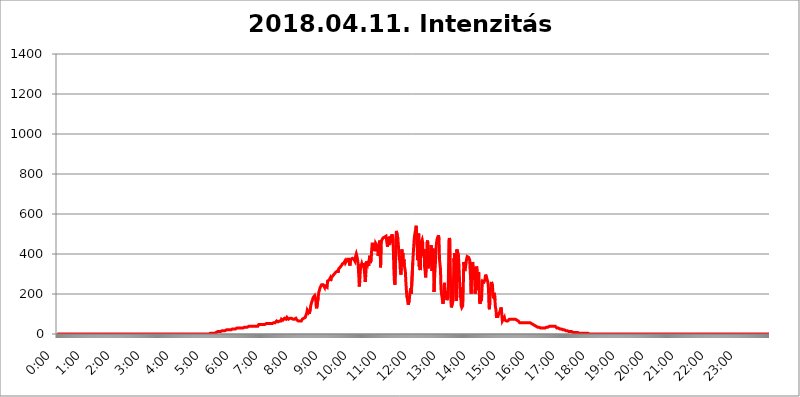
| Category | 2018.04.11. Intenzitás [W/m^2] |
|---|---|
| 0.0 | 0 |
| 0.0006944444444444445 | 0 |
| 0.001388888888888889 | 0 |
| 0.0020833333333333333 | 0 |
| 0.002777777777777778 | 0 |
| 0.003472222222222222 | 0 |
| 0.004166666666666667 | 0 |
| 0.004861111111111111 | 0 |
| 0.005555555555555556 | 0 |
| 0.0062499999999999995 | 0 |
| 0.006944444444444444 | 0 |
| 0.007638888888888889 | 0 |
| 0.008333333333333333 | 0 |
| 0.009027777777777779 | 0 |
| 0.009722222222222222 | 0 |
| 0.010416666666666666 | 0 |
| 0.011111111111111112 | 0 |
| 0.011805555555555555 | 0 |
| 0.012499999999999999 | 0 |
| 0.013194444444444444 | 0 |
| 0.013888888888888888 | 0 |
| 0.014583333333333332 | 0 |
| 0.015277777777777777 | 0 |
| 0.015972222222222224 | 0 |
| 0.016666666666666666 | 0 |
| 0.017361111111111112 | 0 |
| 0.018055555555555557 | 0 |
| 0.01875 | 0 |
| 0.019444444444444445 | 0 |
| 0.02013888888888889 | 0 |
| 0.020833333333333332 | 0 |
| 0.02152777777777778 | 0 |
| 0.022222222222222223 | 0 |
| 0.02291666666666667 | 0 |
| 0.02361111111111111 | 0 |
| 0.024305555555555556 | 0 |
| 0.024999999999999998 | 0 |
| 0.025694444444444447 | 0 |
| 0.02638888888888889 | 0 |
| 0.027083333333333334 | 0 |
| 0.027777777777777776 | 0 |
| 0.02847222222222222 | 0 |
| 0.029166666666666664 | 0 |
| 0.029861111111111113 | 0 |
| 0.030555555555555555 | 0 |
| 0.03125 | 0 |
| 0.03194444444444445 | 0 |
| 0.03263888888888889 | 0 |
| 0.03333333333333333 | 0 |
| 0.034027777777777775 | 0 |
| 0.034722222222222224 | 0 |
| 0.035416666666666666 | 0 |
| 0.036111111111111115 | 0 |
| 0.03680555555555556 | 0 |
| 0.0375 | 0 |
| 0.03819444444444444 | 0 |
| 0.03888888888888889 | 0 |
| 0.03958333333333333 | 0 |
| 0.04027777777777778 | 0 |
| 0.04097222222222222 | 0 |
| 0.041666666666666664 | 0 |
| 0.042361111111111106 | 0 |
| 0.04305555555555556 | 0 |
| 0.043750000000000004 | 0 |
| 0.044444444444444446 | 0 |
| 0.04513888888888889 | 0 |
| 0.04583333333333334 | 0 |
| 0.04652777777777778 | 0 |
| 0.04722222222222222 | 0 |
| 0.04791666666666666 | 0 |
| 0.04861111111111111 | 0 |
| 0.049305555555555554 | 0 |
| 0.049999999999999996 | 0 |
| 0.05069444444444445 | 0 |
| 0.051388888888888894 | 0 |
| 0.052083333333333336 | 0 |
| 0.05277777777777778 | 0 |
| 0.05347222222222222 | 0 |
| 0.05416666666666667 | 0 |
| 0.05486111111111111 | 0 |
| 0.05555555555555555 | 0 |
| 0.05625 | 0 |
| 0.05694444444444444 | 0 |
| 0.057638888888888885 | 0 |
| 0.05833333333333333 | 0 |
| 0.05902777777777778 | 0 |
| 0.059722222222222225 | 0 |
| 0.06041666666666667 | 0 |
| 0.061111111111111116 | 0 |
| 0.06180555555555556 | 0 |
| 0.0625 | 0 |
| 0.06319444444444444 | 0 |
| 0.06388888888888888 | 0 |
| 0.06458333333333334 | 0 |
| 0.06527777777777778 | 0 |
| 0.06597222222222222 | 0 |
| 0.06666666666666667 | 0 |
| 0.06736111111111111 | 0 |
| 0.06805555555555555 | 0 |
| 0.06874999999999999 | 0 |
| 0.06944444444444443 | 0 |
| 0.07013888888888889 | 0 |
| 0.07083333333333333 | 0 |
| 0.07152777777777779 | 0 |
| 0.07222222222222223 | 0 |
| 0.07291666666666667 | 0 |
| 0.07361111111111111 | 0 |
| 0.07430555555555556 | 0 |
| 0.075 | 0 |
| 0.07569444444444444 | 0 |
| 0.0763888888888889 | 0 |
| 0.07708333333333334 | 0 |
| 0.07777777777777778 | 0 |
| 0.07847222222222222 | 0 |
| 0.07916666666666666 | 0 |
| 0.0798611111111111 | 0 |
| 0.08055555555555556 | 0 |
| 0.08125 | 0 |
| 0.08194444444444444 | 0 |
| 0.08263888888888889 | 0 |
| 0.08333333333333333 | 0 |
| 0.08402777777777777 | 0 |
| 0.08472222222222221 | 0 |
| 0.08541666666666665 | 0 |
| 0.08611111111111112 | 0 |
| 0.08680555555555557 | 0 |
| 0.08750000000000001 | 0 |
| 0.08819444444444445 | 0 |
| 0.08888888888888889 | 0 |
| 0.08958333333333333 | 0 |
| 0.09027777777777778 | 0 |
| 0.09097222222222222 | 0 |
| 0.09166666666666667 | 0 |
| 0.09236111111111112 | 0 |
| 0.09305555555555556 | 0 |
| 0.09375 | 0 |
| 0.09444444444444444 | 0 |
| 0.09513888888888888 | 0 |
| 0.09583333333333333 | 0 |
| 0.09652777777777777 | 0 |
| 0.09722222222222222 | 0 |
| 0.09791666666666667 | 0 |
| 0.09861111111111111 | 0 |
| 0.09930555555555555 | 0 |
| 0.09999999999999999 | 0 |
| 0.10069444444444443 | 0 |
| 0.1013888888888889 | 0 |
| 0.10208333333333335 | 0 |
| 0.10277777777777779 | 0 |
| 0.10347222222222223 | 0 |
| 0.10416666666666667 | 0 |
| 0.10486111111111111 | 0 |
| 0.10555555555555556 | 0 |
| 0.10625 | 0 |
| 0.10694444444444444 | 0 |
| 0.1076388888888889 | 0 |
| 0.10833333333333334 | 0 |
| 0.10902777777777778 | 0 |
| 0.10972222222222222 | 0 |
| 0.1111111111111111 | 0 |
| 0.11180555555555556 | 0 |
| 0.11180555555555556 | 0 |
| 0.1125 | 0 |
| 0.11319444444444444 | 0 |
| 0.11388888888888889 | 0 |
| 0.11458333333333333 | 0 |
| 0.11527777777777777 | 0 |
| 0.11597222222222221 | 0 |
| 0.11666666666666665 | 0 |
| 0.1173611111111111 | 0 |
| 0.11805555555555557 | 0 |
| 0.11944444444444445 | 0 |
| 0.12013888888888889 | 0 |
| 0.12083333333333333 | 0 |
| 0.12152777777777778 | 0 |
| 0.12222222222222223 | 0 |
| 0.12291666666666667 | 0 |
| 0.12291666666666667 | 0 |
| 0.12361111111111112 | 0 |
| 0.12430555555555556 | 0 |
| 0.125 | 0 |
| 0.12569444444444444 | 0 |
| 0.12638888888888888 | 0 |
| 0.12708333333333333 | 0 |
| 0.16875 | 0 |
| 0.12847222222222224 | 0 |
| 0.12916666666666668 | 0 |
| 0.12986111111111112 | 0 |
| 0.13055555555555556 | 0 |
| 0.13125 | 0 |
| 0.13194444444444445 | 0 |
| 0.1326388888888889 | 0 |
| 0.13333333333333333 | 0 |
| 0.13402777777777777 | 0 |
| 0.13402777777777777 | 0 |
| 0.13472222222222222 | 0 |
| 0.13541666666666666 | 0 |
| 0.1361111111111111 | 0 |
| 0.13749999999999998 | 0 |
| 0.13819444444444443 | 0 |
| 0.1388888888888889 | 0 |
| 0.13958333333333334 | 0 |
| 0.14027777777777778 | 0 |
| 0.14097222222222222 | 0 |
| 0.14166666666666666 | 0 |
| 0.1423611111111111 | 0 |
| 0.14305555555555557 | 0 |
| 0.14375000000000002 | 0 |
| 0.14444444444444446 | 0 |
| 0.1451388888888889 | 0 |
| 0.1451388888888889 | 0 |
| 0.14652777777777778 | 0 |
| 0.14722222222222223 | 0 |
| 0.14791666666666667 | 0 |
| 0.1486111111111111 | 0 |
| 0.14930555555555555 | 0 |
| 0.15 | 0 |
| 0.15069444444444444 | 0 |
| 0.15138888888888888 | 0 |
| 0.15208333333333332 | 0 |
| 0.15277777777777776 | 0 |
| 0.15347222222222223 | 0 |
| 0.15416666666666667 | 0 |
| 0.15486111111111112 | 0 |
| 0.15555555555555556 | 0 |
| 0.15625 | 0 |
| 0.15694444444444444 | 0 |
| 0.15763888888888888 | 0 |
| 0.15833333333333333 | 0 |
| 0.15902777777777777 | 0 |
| 0.15972222222222224 | 0 |
| 0.16041666666666668 | 0 |
| 0.16111111111111112 | 0 |
| 0.16180555555555556 | 0 |
| 0.1625 | 0 |
| 0.16319444444444445 | 0 |
| 0.1638888888888889 | 0 |
| 0.16458333333333333 | 0 |
| 0.16527777777777777 | 0 |
| 0.16597222222222222 | 0 |
| 0.16666666666666666 | 0 |
| 0.1673611111111111 | 0 |
| 0.16805555555555554 | 0 |
| 0.16874999999999998 | 0 |
| 0.16944444444444443 | 0 |
| 0.17013888888888887 | 0 |
| 0.1708333333333333 | 0 |
| 0.17152777777777775 | 0 |
| 0.17222222222222225 | 0 |
| 0.1729166666666667 | 0 |
| 0.17361111111111113 | 0 |
| 0.17430555555555557 | 0 |
| 0.17500000000000002 | 0 |
| 0.17569444444444446 | 0 |
| 0.1763888888888889 | 0 |
| 0.17708333333333334 | 0 |
| 0.17777777777777778 | 0 |
| 0.17847222222222223 | 0 |
| 0.17916666666666667 | 0 |
| 0.1798611111111111 | 0 |
| 0.18055555555555555 | 0 |
| 0.18125 | 0 |
| 0.18194444444444444 | 0 |
| 0.1826388888888889 | 0 |
| 0.18333333333333335 | 0 |
| 0.1840277777777778 | 0 |
| 0.18472222222222223 | 0 |
| 0.18541666666666667 | 0 |
| 0.18611111111111112 | 0 |
| 0.18680555555555556 | 0 |
| 0.1875 | 0 |
| 0.18819444444444444 | 0 |
| 0.18888888888888888 | 0 |
| 0.18958333333333333 | 0 |
| 0.19027777777777777 | 0 |
| 0.1909722222222222 | 0 |
| 0.19166666666666665 | 0 |
| 0.19236111111111112 | 0 |
| 0.19305555555555554 | 0 |
| 0.19375 | 0 |
| 0.19444444444444445 | 0 |
| 0.1951388888888889 | 0 |
| 0.19583333333333333 | 0 |
| 0.19652777777777777 | 0 |
| 0.19722222222222222 | 0 |
| 0.19791666666666666 | 0 |
| 0.1986111111111111 | 0 |
| 0.19930555555555554 | 0 |
| 0.19999999999999998 | 0 |
| 0.20069444444444443 | 0 |
| 0.20138888888888887 | 0 |
| 0.2020833333333333 | 0 |
| 0.2027777777777778 | 0 |
| 0.2034722222222222 | 0 |
| 0.2041666666666667 | 0 |
| 0.20486111111111113 | 0 |
| 0.20555555555555557 | 0 |
| 0.20625000000000002 | 0 |
| 0.20694444444444446 | 0 |
| 0.2076388888888889 | 0 |
| 0.20833333333333334 | 0 |
| 0.20902777777777778 | 0 |
| 0.20972222222222223 | 0 |
| 0.21041666666666667 | 0 |
| 0.2111111111111111 | 0 |
| 0.21180555555555555 | 0 |
| 0.2125 | 0 |
| 0.21319444444444444 | 0 |
| 0.2138888888888889 | 0 |
| 0.21458333333333335 | 3.525 |
| 0.2152777777777778 | 3.525 |
| 0.21597222222222223 | 3.525 |
| 0.21666666666666667 | 3.525 |
| 0.21736111111111112 | 3.525 |
| 0.21805555555555556 | 3.525 |
| 0.21875 | 3.525 |
| 0.21944444444444444 | 3.525 |
| 0.22013888888888888 | 3.525 |
| 0.22083333333333333 | 3.525 |
| 0.22152777777777777 | 7.887 |
| 0.2222222222222222 | 7.887 |
| 0.22291666666666665 | 7.887 |
| 0.2236111111111111 | 7.887 |
| 0.22430555555555556 | 12.257 |
| 0.225 | 12.257 |
| 0.22569444444444445 | 12.257 |
| 0.2263888888888889 | 12.257 |
| 0.22708333333333333 | 12.257 |
| 0.22777777777777777 | 12.257 |
| 0.22847222222222222 | 12.257 |
| 0.22916666666666666 | 12.257 |
| 0.2298611111111111 | 12.257 |
| 0.23055555555555554 | 16.636 |
| 0.23124999999999998 | 16.636 |
| 0.23194444444444443 | 16.636 |
| 0.23263888888888887 | 16.636 |
| 0.2333333333333333 | 16.636 |
| 0.2340277777777778 | 16.636 |
| 0.2347222222222222 | 16.636 |
| 0.2354166666666667 | 16.636 |
| 0.23611111111111113 | 21.024 |
| 0.23680555555555557 | 21.024 |
| 0.23750000000000002 | 21.024 |
| 0.23819444444444446 | 21.024 |
| 0.2388888888888889 | 21.024 |
| 0.23958333333333334 | 21.024 |
| 0.24027777777777778 | 21.024 |
| 0.24097222222222223 | 21.024 |
| 0.24166666666666667 | 21.024 |
| 0.2423611111111111 | 21.024 |
| 0.24305555555555555 | 21.024 |
| 0.24375 | 21.024 |
| 0.24444444444444446 | 21.024 |
| 0.24513888888888888 | 21.024 |
| 0.24583333333333335 | 25.419 |
| 0.2465277777777778 | 25.419 |
| 0.24722222222222223 | 25.419 |
| 0.24791666666666667 | 25.419 |
| 0.24861111111111112 | 25.419 |
| 0.24930555555555556 | 25.419 |
| 0.25 | 25.419 |
| 0.25069444444444444 | 29.823 |
| 0.2513888888888889 | 29.823 |
| 0.2520833333333333 | 29.823 |
| 0.25277777777777777 | 29.823 |
| 0.2534722222222222 | 29.823 |
| 0.25416666666666665 | 29.823 |
| 0.2548611111111111 | 29.823 |
| 0.2555555555555556 | 29.823 |
| 0.25625000000000003 | 29.823 |
| 0.2569444444444445 | 29.823 |
| 0.2576388888888889 | 29.823 |
| 0.25833333333333336 | 29.823 |
| 0.2590277777777778 | 29.823 |
| 0.25972222222222224 | 29.823 |
| 0.2604166666666667 | 29.823 |
| 0.2611111111111111 | 29.823 |
| 0.26180555555555557 | 29.823 |
| 0.2625 | 34.234 |
| 0.26319444444444445 | 34.234 |
| 0.2638888888888889 | 34.234 |
| 0.26458333333333334 | 34.234 |
| 0.2652777777777778 | 38.653 |
| 0.2659722222222222 | 34.234 |
| 0.26666666666666666 | 34.234 |
| 0.2673611111111111 | 38.653 |
| 0.26805555555555555 | 38.653 |
| 0.26875 | 38.653 |
| 0.26944444444444443 | 38.653 |
| 0.2701388888888889 | 34.234 |
| 0.2708333333333333 | 38.653 |
| 0.27152777777777776 | 38.653 |
| 0.2722222222222222 | 38.653 |
| 0.27291666666666664 | 38.653 |
| 0.2736111111111111 | 38.653 |
| 0.2743055555555555 | 38.653 |
| 0.27499999999999997 | 38.653 |
| 0.27569444444444446 | 38.653 |
| 0.27638888888888885 | 38.653 |
| 0.27708333333333335 | 38.653 |
| 0.2777777777777778 | 38.653 |
| 0.27847222222222223 | 38.653 |
| 0.2791666666666667 | 38.653 |
| 0.2798611111111111 | 38.653 |
| 0.28055555555555556 | 38.653 |
| 0.28125 | 38.653 |
| 0.28194444444444444 | 43.079 |
| 0.2826388888888889 | 47.511 |
| 0.2833333333333333 | 47.511 |
| 0.28402777777777777 | 47.511 |
| 0.2847222222222222 | 47.511 |
| 0.28541666666666665 | 47.511 |
| 0.28611111111111115 | 47.511 |
| 0.28680555555555554 | 47.511 |
| 0.28750000000000003 | 47.511 |
| 0.2881944444444445 | 47.511 |
| 0.2888888888888889 | 47.511 |
| 0.28958333333333336 | 47.511 |
| 0.2902777777777778 | 47.511 |
| 0.29097222222222224 | 47.511 |
| 0.2916666666666667 | 51.951 |
| 0.2923611111111111 | 51.951 |
| 0.29305555555555557 | 51.951 |
| 0.29375 | 51.951 |
| 0.29444444444444445 | 51.951 |
| 0.2951388888888889 | 51.951 |
| 0.29583333333333334 | 51.951 |
| 0.2965277777777778 | 51.951 |
| 0.2972222222222222 | 51.951 |
| 0.29791666666666666 | 51.951 |
| 0.2986111111111111 | 51.951 |
| 0.29930555555555555 | 51.951 |
| 0.3 | 51.951 |
| 0.30069444444444443 | 51.951 |
| 0.3013888888888889 | 51.951 |
| 0.3020833333333333 | 56.398 |
| 0.30277777777777776 | 56.398 |
| 0.3034722222222222 | 56.398 |
| 0.30416666666666664 | 56.398 |
| 0.3048611111111111 | 56.398 |
| 0.3055555555555555 | 56.398 |
| 0.30624999999999997 | 60.85 |
| 0.3069444444444444 | 60.85 |
| 0.3076388888888889 | 65.31 |
| 0.30833333333333335 | 65.31 |
| 0.3090277777777778 | 60.85 |
| 0.30972222222222223 | 60.85 |
| 0.3104166666666667 | 60.85 |
| 0.3111111111111111 | 60.85 |
| 0.31180555555555556 | 65.31 |
| 0.3125 | 65.31 |
| 0.31319444444444444 | 65.31 |
| 0.3138888888888889 | 65.31 |
| 0.3145833333333333 | 74.246 |
| 0.31527777777777777 | 69.775 |
| 0.3159722222222222 | 69.775 |
| 0.31666666666666665 | 69.775 |
| 0.31736111111111115 | 69.775 |
| 0.31805555555555554 | 74.246 |
| 0.31875000000000003 | 78.722 |
| 0.3194444444444445 | 78.722 |
| 0.3201388888888889 | 78.722 |
| 0.32083333333333336 | 74.246 |
| 0.3215277777777778 | 74.246 |
| 0.32222222222222224 | 83.205 |
| 0.3229166666666667 | 83.205 |
| 0.3236111111111111 | 78.722 |
| 0.32430555555555557 | 74.246 |
| 0.325 | 74.246 |
| 0.32569444444444445 | 78.722 |
| 0.3263888888888889 | 78.722 |
| 0.32708333333333334 | 78.722 |
| 0.3277777777777778 | 78.722 |
| 0.3284722222222222 | 78.722 |
| 0.32916666666666666 | 78.722 |
| 0.3298611111111111 | 74.246 |
| 0.33055555555555555 | 74.246 |
| 0.33125 | 74.246 |
| 0.33194444444444443 | 74.246 |
| 0.3326388888888889 | 74.246 |
| 0.3333333333333333 | 74.246 |
| 0.3340277777777778 | 74.246 |
| 0.3347222222222222 | 78.722 |
| 0.3354166666666667 | 74.246 |
| 0.3361111111111111 | 69.775 |
| 0.3368055555555556 | 69.775 |
| 0.33749999999999997 | 65.31 |
| 0.33819444444444446 | 65.31 |
| 0.33888888888888885 | 65.31 |
| 0.33958333333333335 | 65.31 |
| 0.34027777777777773 | 65.31 |
| 0.34097222222222223 | 65.31 |
| 0.3416666666666666 | 65.31 |
| 0.3423611111111111 | 65.31 |
| 0.3430555555555555 | 69.775 |
| 0.34375 | 74.246 |
| 0.3444444444444445 | 74.246 |
| 0.3451388888888889 | 78.722 |
| 0.3458333333333334 | 78.722 |
| 0.34652777777777777 | 83.205 |
| 0.34722222222222227 | 78.722 |
| 0.34791666666666665 | 83.205 |
| 0.34861111111111115 | 92.184 |
| 0.34930555555555554 | 96.682 |
| 0.35000000000000003 | 105.69 |
| 0.3506944444444444 | 119.235 |
| 0.3513888888888889 | 123.758 |
| 0.3520833333333333 | 110.201 |
| 0.3527777777777778 | 119.235 |
| 0.3534722222222222 | 101.184 |
| 0.3541666666666667 | 96.682 |
| 0.3548611111111111 | 123.758 |
| 0.35555555555555557 | 141.884 |
| 0.35625 | 146.423 |
| 0.35694444444444445 | 160.056 |
| 0.3576388888888889 | 164.605 |
| 0.35833333333333334 | 173.709 |
| 0.3590277777777778 | 182.82 |
| 0.3597222222222222 | 182.82 |
| 0.36041666666666666 | 182.82 |
| 0.3611111111111111 | 191.937 |
| 0.36180555555555555 | 187.378 |
| 0.3625 | 173.709 |
| 0.36319444444444443 | 137.347 |
| 0.3638888888888889 | 128.284 |
| 0.3645833333333333 | 123.758 |
| 0.3652777777777778 | 132.814 |
| 0.3659722222222222 | 182.82 |
| 0.3666666666666667 | 205.62 |
| 0.3673611111111111 | 214.746 |
| 0.3680555555555556 | 214.746 |
| 0.36874999999999997 | 233 |
| 0.36944444444444446 | 237.564 |
| 0.37013888888888885 | 237.564 |
| 0.37083333333333335 | 246.689 |
| 0.37152777777777773 | 246.689 |
| 0.37222222222222223 | 246.689 |
| 0.3729166666666666 | 246.689 |
| 0.3736111111111111 | 242.127 |
| 0.3743055555555555 | 242.127 |
| 0.375 | 233 |
| 0.3756944444444445 | 246.689 |
| 0.3763888888888889 | 237.564 |
| 0.3770833333333334 | 242.127 |
| 0.37777777777777777 | 242.127 |
| 0.37847222222222227 | 233 |
| 0.37916666666666665 | 264.932 |
| 0.37986111111111115 | 264.932 |
| 0.38055555555555554 | 264.932 |
| 0.38125000000000003 | 269.49 |
| 0.3819444444444444 | 274.047 |
| 0.3826388888888889 | 278.603 |
| 0.3833333333333333 | 264.932 |
| 0.3840277777777778 | 274.047 |
| 0.3847222222222222 | 283.156 |
| 0.3854166666666667 | 287.709 |
| 0.3861111111111111 | 283.156 |
| 0.38680555555555557 | 292.259 |
| 0.3875 | 296.808 |
| 0.38819444444444445 | 296.808 |
| 0.3888888888888889 | 301.354 |
| 0.38958333333333334 | 296.808 |
| 0.3902777777777778 | 305.898 |
| 0.3909722222222222 | 310.44 |
| 0.39166666666666666 | 314.98 |
| 0.3923611111111111 | 310.44 |
| 0.39305555555555555 | 314.98 |
| 0.39375 | 305.898 |
| 0.39444444444444443 | 324.052 |
| 0.3951388888888889 | 328.584 |
| 0.3958333333333333 | 328.584 |
| 0.3965277777777778 | 333.113 |
| 0.3972222222222222 | 333.113 |
| 0.3979166666666667 | 337.639 |
| 0.3986111111111111 | 342.162 |
| 0.3993055555555556 | 346.682 |
| 0.39999999999999997 | 351.198 |
| 0.40069444444444446 | 351.198 |
| 0.40138888888888885 | 355.712 |
| 0.40208333333333335 | 355.712 |
| 0.40277777777777773 | 360.221 |
| 0.40347222222222223 | 364.728 |
| 0.4041666666666666 | 355.712 |
| 0.4048611111111111 | 360.221 |
| 0.4055555555555555 | 364.728 |
| 0.40625 | 369.23 |
| 0.4069444444444445 | 373.729 |
| 0.4076388888888889 | 373.729 |
| 0.4083333333333334 | 369.23 |
| 0.40902777777777777 | 373.729 |
| 0.40972222222222227 | 355.712 |
| 0.41041666666666665 | 342.162 |
| 0.41111111111111115 | 360.221 |
| 0.41180555555555554 | 373.729 |
| 0.41250000000000003 | 378.224 |
| 0.4131944444444444 | 378.224 |
| 0.4138888888888889 | 378.224 |
| 0.4145833333333333 | 378.224 |
| 0.4152777777777778 | 373.729 |
| 0.4159722222222222 | 373.729 |
| 0.4166666666666667 | 369.23 |
| 0.4173611111111111 | 364.728 |
| 0.41805555555555557 | 382.715 |
| 0.41875 | 391.685 |
| 0.41944444444444445 | 400.638 |
| 0.4201388888888889 | 391.685 |
| 0.42083333333333334 | 378.224 |
| 0.4215277777777778 | 364.728 |
| 0.4222222222222222 | 333.113 |
| 0.42291666666666666 | 292.259 |
| 0.4236111111111111 | 237.564 |
| 0.42430555555555555 | 264.932 |
| 0.425 | 314.98 |
| 0.42569444444444443 | 351.198 |
| 0.4263888888888889 | 342.162 |
| 0.4270833333333333 | 351.198 |
| 0.4277777777777778 | 342.162 |
| 0.4284722222222222 | 337.639 |
| 0.4291666666666667 | 342.162 |
| 0.4298611111111111 | 346.682 |
| 0.4305555555555556 | 346.682 |
| 0.43124999999999997 | 296.808 |
| 0.43194444444444446 | 260.373 |
| 0.43263888888888885 | 292.259 |
| 0.43333333333333335 | 333.113 |
| 0.43402777777777773 | 364.728 |
| 0.43472222222222223 | 369.23 |
| 0.4354166666666666 | 351.198 |
| 0.4361111111111111 | 364.728 |
| 0.4368055555555555 | 342.162 |
| 0.4375 | 364.728 |
| 0.4381944444444445 | 391.685 |
| 0.4388888888888889 | 355.712 |
| 0.4395833333333334 | 351.198 |
| 0.44027777777777777 | 369.23 |
| 0.44097222222222227 | 418.492 |
| 0.44166666666666665 | 449.551 |
| 0.44236111111111115 | 449.551 |
| 0.44305555555555554 | 449.551 |
| 0.44375000000000003 | 449.551 |
| 0.4444444444444444 | 449.551 |
| 0.4451388888888889 | 414.035 |
| 0.4458333333333333 | 427.39 |
| 0.4465277777777778 | 453.968 |
| 0.4472222222222222 | 453.968 |
| 0.4479166666666667 | 449.551 |
| 0.4486111111111111 | 440.702 |
| 0.44930555555555557 | 431.833 |
| 0.45 | 391.685 |
| 0.45069444444444445 | 405.108 |
| 0.4513888888888889 | 445.129 |
| 0.45208333333333334 | 467.187 |
| 0.4527777777777778 | 449.551 |
| 0.4534722222222222 | 333.113 |
| 0.45416666666666666 | 440.702 |
| 0.4548611111111111 | 467.187 |
| 0.45555555555555555 | 467.187 |
| 0.45625 | 471.582 |
| 0.45694444444444443 | 480.356 |
| 0.4576388888888889 | 480.356 |
| 0.4583333333333333 | 484.735 |
| 0.4590277777777778 | 484.735 |
| 0.4597222222222222 | 480.356 |
| 0.4604166666666667 | 484.735 |
| 0.4611111111111111 | 489.108 |
| 0.4618055555555556 | 489.108 |
| 0.46249999999999997 | 484.735 |
| 0.46319444444444446 | 436.27 |
| 0.46388888888888885 | 431.833 |
| 0.46458333333333335 | 484.735 |
| 0.46527777777777773 | 445.129 |
| 0.46597222222222223 | 453.968 |
| 0.4666666666666666 | 489.108 |
| 0.4673611111111111 | 475.972 |
| 0.4680555555555555 | 475.972 |
| 0.46875 | 453.968 |
| 0.4694444444444445 | 497.836 |
| 0.4701388888888889 | 493.475 |
| 0.4708333333333334 | 467.187 |
| 0.47152777777777777 | 405.108 |
| 0.47222222222222227 | 310.44 |
| 0.47291666666666665 | 260.373 |
| 0.47361111111111115 | 246.689 |
| 0.47430555555555554 | 342.162 |
| 0.47500000000000003 | 480.356 |
| 0.4756944444444444 | 515.223 |
| 0.4763888888888889 | 519.555 |
| 0.4770833333333333 | 510.885 |
| 0.4777777777777778 | 475.972 |
| 0.4784722222222222 | 471.582 |
| 0.4791666666666667 | 475.972 |
| 0.4798611111111111 | 369.23 |
| 0.48055555555555557 | 387.202 |
| 0.48125 | 324.052 |
| 0.48194444444444445 | 296.808 |
| 0.4826388888888889 | 333.113 |
| 0.48333333333333334 | 422.943 |
| 0.4840277777777778 | 391.685 |
| 0.4847222222222222 | 405.108 |
| 0.48541666666666666 | 346.682 |
| 0.4861111111111111 | 373.729 |
| 0.48680555555555555 | 342.162 |
| 0.4875 | 328.584 |
| 0.48819444444444443 | 314.98 |
| 0.4888888888888889 | 264.932 |
| 0.4895833333333333 | 223.873 |
| 0.4902777777777778 | 187.378 |
| 0.4909722222222222 | 178.264 |
| 0.4916666666666667 | 160.056 |
| 0.4923611111111111 | 146.423 |
| 0.4930555555555556 | 146.423 |
| 0.49374999999999997 | 169.156 |
| 0.49444444444444446 | 201.058 |
| 0.49513888888888885 | 214.746 |
| 0.49583333333333335 | 228.436 |
| 0.49652777777777773 | 201.058 |
| 0.49722222222222223 | 205.62 |
| 0.4979166666666666 | 201.058 |
| 0.4986111111111111 | 355.712 |
| 0.4993055555555555 | 400.638 |
| 0.5 | 440.702 |
| 0.5006944444444444 | 475.972 |
| 0.5013888888888889 | 497.836 |
| 0.5020833333333333 | 510.885 |
| 0.5027777777777778 | 523.88 |
| 0.5034722222222222 | 541.121 |
| 0.5041666666666667 | 541.121 |
| 0.5048611111111111 | 436.27 |
| 0.5055555555555555 | 369.23 |
| 0.50625 | 453.968 |
| 0.5069444444444444 | 502.192 |
| 0.5076388888888889 | 337.639 |
| 0.5083333333333333 | 351.198 |
| 0.5090277777777777 | 319.517 |
| 0.5097222222222222 | 387.202 |
| 0.5104166666666666 | 458.38 |
| 0.5111111111111112 | 462.786 |
| 0.5118055555555555 | 471.582 |
| 0.5125000000000001 | 458.38 |
| 0.5131944444444444 | 391.685 |
| 0.513888888888889 | 414.035 |
| 0.5145833333333333 | 422.943 |
| 0.5152777777777778 | 333.113 |
| 0.5159722222222222 | 314.98 |
| 0.5166666666666667 | 283.156 |
| 0.517361111111111 | 333.113 |
| 0.5180555555555556 | 387.202 |
| 0.5187499999999999 | 458.38 |
| 0.5194444444444445 | 467.187 |
| 0.5201388888888888 | 328.584 |
| 0.5208333333333334 | 333.113 |
| 0.5215277777777778 | 355.712 |
| 0.5222222222222223 | 355.712 |
| 0.5229166666666667 | 351.198 |
| 0.5236111111111111 | 409.574 |
| 0.5243055555555556 | 445.129 |
| 0.525 | 440.702 |
| 0.5256944444444445 | 314.98 |
| 0.5263888888888889 | 373.729 |
| 0.5270833333333333 | 427.39 |
| 0.5277777777777778 | 342.162 |
| 0.5284722222222222 | 210.182 |
| 0.5291666666666667 | 274.047 |
| 0.5298611111111111 | 324.052 |
| 0.5305555555555556 | 364.728 |
| 0.53125 | 427.39 |
| 0.5319444444444444 | 453.968 |
| 0.5326388888888889 | 471.582 |
| 0.5333333333333333 | 480.356 |
| 0.5340277777777778 | 480.356 |
| 0.5347222222222222 | 493.475 |
| 0.5354166666666667 | 471.582 |
| 0.5361111111111111 | 373.729 |
| 0.5368055555555555 | 369.23 |
| 0.5375 | 324.052 |
| 0.5381944444444444 | 228.436 |
| 0.5388888888888889 | 201.058 |
| 0.5395833333333333 | 187.378 |
| 0.5402777777777777 | 169.156 |
| 0.5409722222222222 | 150.964 |
| 0.5416666666666666 | 169.156 |
| 0.5423611111111112 | 233 |
| 0.5430555555555555 | 255.813 |
| 0.5437500000000001 | 191.937 |
| 0.5444444444444444 | 214.746 |
| 0.545138888888889 | 219.309 |
| 0.5458333333333333 | 182.82 |
| 0.5465277777777778 | 169.156 |
| 0.5472222222222222 | 173.709 |
| 0.5479166666666667 | 187.378 |
| 0.548611111111111 | 278.603 |
| 0.5493055555555556 | 467.187 |
| 0.5499999999999999 | 480.356 |
| 0.5506944444444445 | 467.187 |
| 0.5513888888888888 | 301.354 |
| 0.5520833333333334 | 164.605 |
| 0.5527777777777778 | 132.814 |
| 0.5534722222222223 | 128.284 |
| 0.5541666666666667 | 132.814 |
| 0.5548611111111111 | 164.605 |
| 0.5555555555555556 | 210.182 |
| 0.55625 | 378.224 |
| 0.5569444444444445 | 360.221 |
| 0.5576388888888889 | 405.108 |
| 0.5583333333333333 | 283.156 |
| 0.5590277777777778 | 396.164 |
| 0.5597222222222222 | 164.605 |
| 0.5604166666666667 | 422.943 |
| 0.5611111111111111 | 414.035 |
| 0.5618055555555556 | 414.035 |
| 0.5625 | 400.638 |
| 0.5631944444444444 | 360.221 |
| 0.5638888888888889 | 296.808 |
| 0.5645833333333333 | 237.564 |
| 0.5652777777777778 | 182.82 |
| 0.5659722222222222 | 233 |
| 0.5666666666666667 | 141.884 |
| 0.5673611111111111 | 132.814 |
| 0.5680555555555555 | 132.814 |
| 0.56875 | 141.884 |
| 0.5694444444444444 | 228.436 |
| 0.5701388888888889 | 360.221 |
| 0.5708333333333333 | 342.162 |
| 0.5715277777777777 | 314.98 |
| 0.5722222222222222 | 324.052 |
| 0.5729166666666666 | 342.162 |
| 0.5736111111111112 | 360.221 |
| 0.5743055555555555 | 378.224 |
| 0.5750000000000001 | 387.202 |
| 0.5756944444444444 | 382.715 |
| 0.576388888888889 | 382.715 |
| 0.5770833333333333 | 382.715 |
| 0.5777777777777778 | 382.715 |
| 0.5784722222222222 | 369.23 |
| 0.5791666666666667 | 364.728 |
| 0.579861111111111 | 264.932 |
| 0.5805555555555556 | 201.058 |
| 0.5812499999999999 | 333.113 |
| 0.5819444444444445 | 346.682 |
| 0.5826388888888888 | 360.221 |
| 0.5833333333333334 | 324.052 |
| 0.5840277777777778 | 333.113 |
| 0.5847222222222223 | 337.639 |
| 0.5854166666666667 | 269.49 |
| 0.5861111111111111 | 201.058 |
| 0.5868055555555556 | 242.127 |
| 0.5875 | 269.49 |
| 0.5881944444444445 | 337.639 |
| 0.5888888888888889 | 310.44 |
| 0.5895833333333333 | 219.309 |
| 0.5902777777777778 | 242.127 |
| 0.5909722222222222 | 310.44 |
| 0.5916666666666667 | 237.564 |
| 0.5923611111111111 | 160.056 |
| 0.5930555555555556 | 150.964 |
| 0.59375 | 173.709 |
| 0.5944444444444444 | 164.605 |
| 0.5951388888888889 | 178.264 |
| 0.5958333333333333 | 233 |
| 0.5965277777777778 | 264.932 |
| 0.5972222222222222 | 264.932 |
| 0.5979166666666667 | 269.49 |
| 0.5986111111111111 | 260.373 |
| 0.5993055555555555 | 264.932 |
| 0.6 | 274.047 |
| 0.6006944444444444 | 296.808 |
| 0.6013888888888889 | 301.354 |
| 0.6020833333333333 | 283.156 |
| 0.6027777777777777 | 283.156 |
| 0.6034722222222222 | 278.603 |
| 0.6041666666666666 | 255.813 |
| 0.6048611111111112 | 223.873 |
| 0.6055555555555555 | 132.814 |
| 0.6062500000000001 | 123.758 |
| 0.6069444444444444 | 210.182 |
| 0.607638888888889 | 219.309 |
| 0.6083333333333333 | 233 |
| 0.6090277777777778 | 260.373 |
| 0.6097222222222222 | 260.373 |
| 0.6104166666666667 | 242.127 |
| 0.611111111111111 | 201.058 |
| 0.6118055555555556 | 178.264 |
| 0.6124999999999999 | 187.378 |
| 0.6131944444444445 | 205.62 |
| 0.6138888888888888 | 169.156 |
| 0.6145833333333334 | 132.814 |
| 0.6152777777777778 | 123.758 |
| 0.6159722222222223 | 87.692 |
| 0.6166666666666667 | 92.184 |
| 0.6173611111111111 | 87.692 |
| 0.6180555555555556 | 87.692 |
| 0.61875 | 96.682 |
| 0.6194444444444445 | 101.184 |
| 0.6201388888888889 | 105.69 |
| 0.6208333333333333 | 105.69 |
| 0.6215277777777778 | 119.235 |
| 0.6222222222222222 | 132.814 |
| 0.6229166666666667 | 123.758 |
| 0.6236111111111111 | 92.184 |
| 0.6243055555555556 | 65.31 |
| 0.625 | 65.31 |
| 0.6256944444444444 | 74.246 |
| 0.6263888888888889 | 78.722 |
| 0.6270833333333333 | 83.205 |
| 0.6277777777777778 | 69.775 |
| 0.6284722222222222 | 65.31 |
| 0.6291666666666667 | 65.31 |
| 0.6298611111111111 | 65.31 |
| 0.6305555555555555 | 60.85 |
| 0.63125 | 65.31 |
| 0.6319444444444444 | 65.31 |
| 0.6326388888888889 | 65.31 |
| 0.6333333333333333 | 65.31 |
| 0.6340277777777777 | 74.246 |
| 0.6347222222222222 | 74.246 |
| 0.6354166666666666 | 78.722 |
| 0.6361111111111112 | 74.246 |
| 0.6368055555555555 | 78.722 |
| 0.6375000000000001 | 78.722 |
| 0.6381944444444444 | 74.246 |
| 0.638888888888889 | 74.246 |
| 0.6395833333333333 | 74.246 |
| 0.6402777777777778 | 74.246 |
| 0.6409722222222222 | 74.246 |
| 0.6416666666666667 | 74.246 |
| 0.642361111111111 | 74.246 |
| 0.6430555555555556 | 74.246 |
| 0.6437499999999999 | 74.246 |
| 0.6444444444444445 | 69.775 |
| 0.6451388888888888 | 69.775 |
| 0.6458333333333334 | 65.31 |
| 0.6465277777777778 | 65.31 |
| 0.6472222222222223 | 60.85 |
| 0.6479166666666667 | 60.85 |
| 0.6486111111111111 | 56.398 |
| 0.6493055555555556 | 56.398 |
| 0.65 | 60.85 |
| 0.6506944444444445 | 56.398 |
| 0.6513888888888889 | 56.398 |
| 0.6520833333333333 | 56.398 |
| 0.6527777777777778 | 56.398 |
| 0.6534722222222222 | 56.398 |
| 0.6541666666666667 | 60.85 |
| 0.6548611111111111 | 56.398 |
| 0.6555555555555556 | 60.85 |
| 0.65625 | 60.85 |
| 0.6569444444444444 | 56.398 |
| 0.6576388888888889 | 56.398 |
| 0.6583333333333333 | 56.398 |
| 0.6590277777777778 | 56.398 |
| 0.6597222222222222 | 56.398 |
| 0.6604166666666667 | 56.398 |
| 0.6611111111111111 | 56.398 |
| 0.6618055555555555 | 56.398 |
| 0.6625 | 56.398 |
| 0.6631944444444444 | 56.398 |
| 0.6638888888888889 | 51.951 |
| 0.6645833333333333 | 51.951 |
| 0.6652777777777777 | 51.951 |
| 0.6659722222222222 | 47.511 |
| 0.6666666666666666 | 47.511 |
| 0.6673611111111111 | 47.511 |
| 0.6680555555555556 | 47.511 |
| 0.6687500000000001 | 43.079 |
| 0.6694444444444444 | 43.079 |
| 0.6701388888888888 | 43.079 |
| 0.6708333333333334 | 43.079 |
| 0.6715277777777778 | 38.653 |
| 0.6722222222222222 | 38.653 |
| 0.6729166666666666 | 34.234 |
| 0.6736111111111112 | 34.234 |
| 0.6743055555555556 | 34.234 |
| 0.6749999999999999 | 34.234 |
| 0.6756944444444444 | 34.234 |
| 0.6763888888888889 | 34.234 |
| 0.6770833333333334 | 34.234 |
| 0.6777777777777777 | 29.823 |
| 0.6784722222222223 | 29.823 |
| 0.6791666666666667 | 29.823 |
| 0.6798611111111111 | 29.823 |
| 0.6805555555555555 | 29.823 |
| 0.68125 | 29.823 |
| 0.6819444444444445 | 29.823 |
| 0.6826388888888889 | 34.234 |
| 0.6833333333333332 | 29.823 |
| 0.6840277777777778 | 29.823 |
| 0.6847222222222222 | 34.234 |
| 0.6854166666666667 | 34.234 |
| 0.686111111111111 | 34.234 |
| 0.6868055555555556 | 34.234 |
| 0.6875 | 34.234 |
| 0.6881944444444444 | 34.234 |
| 0.688888888888889 | 34.234 |
| 0.6895833333333333 | 38.653 |
| 0.6902777777777778 | 38.653 |
| 0.6909722222222222 | 38.653 |
| 0.6916666666666668 | 38.653 |
| 0.6923611111111111 | 38.653 |
| 0.6930555555555555 | 38.653 |
| 0.69375 | 38.653 |
| 0.6944444444444445 | 38.653 |
| 0.6951388888888889 | 38.653 |
| 0.6958333333333333 | 38.653 |
| 0.6965277777777777 | 38.653 |
| 0.6972222222222223 | 38.653 |
| 0.6979166666666666 | 38.653 |
| 0.6986111111111111 | 38.653 |
| 0.6993055555555556 | 34.234 |
| 0.7000000000000001 | 34.234 |
| 0.7006944444444444 | 29.823 |
| 0.7013888888888888 | 29.823 |
| 0.7020833333333334 | 29.823 |
| 0.7027777777777778 | 29.823 |
| 0.7034722222222222 | 29.823 |
| 0.7041666666666666 | 29.823 |
| 0.7048611111111112 | 25.419 |
| 0.7055555555555556 | 25.419 |
| 0.7062499999999999 | 25.419 |
| 0.7069444444444444 | 25.419 |
| 0.7076388888888889 | 25.419 |
| 0.7083333333333334 | 21.024 |
| 0.7090277777777777 | 21.024 |
| 0.7097222222222223 | 21.024 |
| 0.7104166666666667 | 21.024 |
| 0.7111111111111111 | 21.024 |
| 0.7118055555555555 | 21.024 |
| 0.7125 | 16.636 |
| 0.7131944444444445 | 16.636 |
| 0.7138888888888889 | 16.636 |
| 0.7145833333333332 | 16.636 |
| 0.7152777777777778 | 16.636 |
| 0.7159722222222222 | 12.257 |
| 0.7166666666666667 | 12.257 |
| 0.717361111111111 | 12.257 |
| 0.7180555555555556 | 12.257 |
| 0.71875 | 12.257 |
| 0.7194444444444444 | 12.257 |
| 0.720138888888889 | 12.257 |
| 0.7208333333333333 | 12.257 |
| 0.7215277777777778 | 12.257 |
| 0.7222222222222222 | 12.257 |
| 0.7229166666666668 | 7.887 |
| 0.7236111111111111 | 7.887 |
| 0.7243055555555555 | 7.887 |
| 0.725 | 7.887 |
| 0.7256944444444445 | 7.887 |
| 0.7263888888888889 | 7.887 |
| 0.7270833333333333 | 7.887 |
| 0.7277777777777777 | 7.887 |
| 0.7284722222222223 | 7.887 |
| 0.7291666666666666 | 7.887 |
| 0.7298611111111111 | 7.887 |
| 0.7305555555555556 | 7.887 |
| 0.7312500000000001 | 7.887 |
| 0.7319444444444444 | 3.525 |
| 0.7326388888888888 | 3.525 |
| 0.7333333333333334 | 3.525 |
| 0.7340277777777778 | 3.525 |
| 0.7347222222222222 | 3.525 |
| 0.7354166666666666 | 3.525 |
| 0.7361111111111112 | 3.525 |
| 0.7368055555555556 | 3.525 |
| 0.7374999999999999 | 3.525 |
| 0.7381944444444444 | 3.525 |
| 0.7388888888888889 | 3.525 |
| 0.7395833333333334 | 3.525 |
| 0.7402777777777777 | 3.525 |
| 0.7409722222222223 | 3.525 |
| 0.7416666666666667 | 3.525 |
| 0.7423611111111111 | 3.525 |
| 0.7430555555555555 | 3.525 |
| 0.74375 | 3.525 |
| 0.7444444444444445 | 3.525 |
| 0.7451388888888889 | 0 |
| 0.7458333333333332 | 3.525 |
| 0.7465277777777778 | 0 |
| 0.7472222222222222 | 0 |
| 0.7479166666666667 | 0 |
| 0.748611111111111 | 0 |
| 0.7493055555555556 | 0 |
| 0.75 | 0 |
| 0.7506944444444444 | 0 |
| 0.751388888888889 | 0 |
| 0.7520833333333333 | 0 |
| 0.7527777777777778 | 0 |
| 0.7534722222222222 | 0 |
| 0.7541666666666668 | 0 |
| 0.7548611111111111 | 0 |
| 0.7555555555555555 | 0 |
| 0.75625 | 0 |
| 0.7569444444444445 | 0 |
| 0.7576388888888889 | 0 |
| 0.7583333333333333 | 0 |
| 0.7590277777777777 | 0 |
| 0.7597222222222223 | 0 |
| 0.7604166666666666 | 0 |
| 0.7611111111111111 | 0 |
| 0.7618055555555556 | 0 |
| 0.7625000000000001 | 0 |
| 0.7631944444444444 | 0 |
| 0.7638888888888888 | 0 |
| 0.7645833333333334 | 0 |
| 0.7652777777777778 | 0 |
| 0.7659722222222222 | 0 |
| 0.7666666666666666 | 0 |
| 0.7673611111111112 | 0 |
| 0.7680555555555556 | 0 |
| 0.7687499999999999 | 0 |
| 0.7694444444444444 | 0 |
| 0.7701388888888889 | 0 |
| 0.7708333333333334 | 0 |
| 0.7715277777777777 | 0 |
| 0.7722222222222223 | 0 |
| 0.7729166666666667 | 0 |
| 0.7736111111111111 | 0 |
| 0.7743055555555555 | 0 |
| 0.775 | 0 |
| 0.7756944444444445 | 0 |
| 0.7763888888888889 | 0 |
| 0.7770833333333332 | 0 |
| 0.7777777777777778 | 0 |
| 0.7784722222222222 | 0 |
| 0.7791666666666667 | 0 |
| 0.779861111111111 | 0 |
| 0.7805555555555556 | 0 |
| 0.78125 | 0 |
| 0.7819444444444444 | 0 |
| 0.782638888888889 | 0 |
| 0.7833333333333333 | 0 |
| 0.7840277777777778 | 0 |
| 0.7847222222222222 | 0 |
| 0.7854166666666668 | 0 |
| 0.7861111111111111 | 0 |
| 0.7868055555555555 | 0 |
| 0.7875 | 0 |
| 0.7881944444444445 | 0 |
| 0.7888888888888889 | 0 |
| 0.7895833333333333 | 0 |
| 0.7902777777777777 | 0 |
| 0.7909722222222223 | 0 |
| 0.7916666666666666 | 0 |
| 0.7923611111111111 | 0 |
| 0.7930555555555556 | 0 |
| 0.7937500000000001 | 0 |
| 0.7944444444444444 | 0 |
| 0.7951388888888888 | 0 |
| 0.7958333333333334 | 0 |
| 0.7965277777777778 | 0 |
| 0.7972222222222222 | 0 |
| 0.7979166666666666 | 0 |
| 0.7986111111111112 | 0 |
| 0.7993055555555556 | 0 |
| 0.7999999999999999 | 0 |
| 0.8006944444444444 | 0 |
| 0.8013888888888889 | 0 |
| 0.8020833333333334 | 0 |
| 0.8027777777777777 | 0 |
| 0.8034722222222223 | 0 |
| 0.8041666666666667 | 0 |
| 0.8048611111111111 | 0 |
| 0.8055555555555555 | 0 |
| 0.80625 | 0 |
| 0.8069444444444445 | 0 |
| 0.8076388888888889 | 0 |
| 0.8083333333333332 | 0 |
| 0.8090277777777778 | 0 |
| 0.8097222222222222 | 0 |
| 0.8104166666666667 | 0 |
| 0.811111111111111 | 0 |
| 0.8118055555555556 | 0 |
| 0.8125 | 0 |
| 0.8131944444444444 | 0 |
| 0.813888888888889 | 0 |
| 0.8145833333333333 | 0 |
| 0.8152777777777778 | 0 |
| 0.8159722222222222 | 0 |
| 0.8166666666666668 | 0 |
| 0.8173611111111111 | 0 |
| 0.8180555555555555 | 0 |
| 0.81875 | 0 |
| 0.8194444444444445 | 0 |
| 0.8201388888888889 | 0 |
| 0.8208333333333333 | 0 |
| 0.8215277777777777 | 0 |
| 0.8222222222222223 | 0 |
| 0.8229166666666666 | 0 |
| 0.8236111111111111 | 0 |
| 0.8243055555555556 | 0 |
| 0.8250000000000001 | 0 |
| 0.8256944444444444 | 0 |
| 0.8263888888888888 | 0 |
| 0.8270833333333334 | 0 |
| 0.8277777777777778 | 0 |
| 0.8284722222222222 | 0 |
| 0.8291666666666666 | 0 |
| 0.8298611111111112 | 0 |
| 0.8305555555555556 | 0 |
| 0.8312499999999999 | 0 |
| 0.8319444444444444 | 0 |
| 0.8326388888888889 | 0 |
| 0.8333333333333334 | 0 |
| 0.8340277777777777 | 0 |
| 0.8347222222222223 | 0 |
| 0.8354166666666667 | 0 |
| 0.8361111111111111 | 0 |
| 0.8368055555555555 | 0 |
| 0.8375 | 0 |
| 0.8381944444444445 | 0 |
| 0.8388888888888889 | 0 |
| 0.8395833333333332 | 0 |
| 0.8402777777777778 | 0 |
| 0.8409722222222222 | 0 |
| 0.8416666666666667 | 0 |
| 0.842361111111111 | 0 |
| 0.8430555555555556 | 0 |
| 0.84375 | 0 |
| 0.8444444444444444 | 0 |
| 0.845138888888889 | 0 |
| 0.8458333333333333 | 0 |
| 0.8465277777777778 | 0 |
| 0.8472222222222222 | 0 |
| 0.8479166666666668 | 0 |
| 0.8486111111111111 | 0 |
| 0.8493055555555555 | 0 |
| 0.85 | 0 |
| 0.8506944444444445 | 0 |
| 0.8513888888888889 | 0 |
| 0.8520833333333333 | 0 |
| 0.8527777777777777 | 0 |
| 0.8534722222222223 | 0 |
| 0.8541666666666666 | 0 |
| 0.8548611111111111 | 0 |
| 0.8555555555555556 | 0 |
| 0.8562500000000001 | 0 |
| 0.8569444444444444 | 0 |
| 0.8576388888888888 | 0 |
| 0.8583333333333334 | 0 |
| 0.8590277777777778 | 0 |
| 0.8597222222222222 | 0 |
| 0.8604166666666666 | 0 |
| 0.8611111111111112 | 0 |
| 0.8618055555555556 | 0 |
| 0.8624999999999999 | 0 |
| 0.8631944444444444 | 0 |
| 0.8638888888888889 | 0 |
| 0.8645833333333334 | 0 |
| 0.8652777777777777 | 0 |
| 0.8659722222222223 | 0 |
| 0.8666666666666667 | 0 |
| 0.8673611111111111 | 0 |
| 0.8680555555555555 | 0 |
| 0.86875 | 0 |
| 0.8694444444444445 | 0 |
| 0.8701388888888889 | 0 |
| 0.8708333333333332 | 0 |
| 0.8715277777777778 | 0 |
| 0.8722222222222222 | 0 |
| 0.8729166666666667 | 0 |
| 0.873611111111111 | 0 |
| 0.8743055555555556 | 0 |
| 0.875 | 0 |
| 0.8756944444444444 | 0 |
| 0.876388888888889 | 0 |
| 0.8770833333333333 | 0 |
| 0.8777777777777778 | 0 |
| 0.8784722222222222 | 0 |
| 0.8791666666666668 | 0 |
| 0.8798611111111111 | 0 |
| 0.8805555555555555 | 0 |
| 0.88125 | 0 |
| 0.8819444444444445 | 0 |
| 0.8826388888888889 | 0 |
| 0.8833333333333333 | 0 |
| 0.8840277777777777 | 0 |
| 0.8847222222222223 | 0 |
| 0.8854166666666666 | 0 |
| 0.8861111111111111 | 0 |
| 0.8868055555555556 | 0 |
| 0.8875000000000001 | 0 |
| 0.8881944444444444 | 0 |
| 0.8888888888888888 | 0 |
| 0.8895833333333334 | 0 |
| 0.8902777777777778 | 0 |
| 0.8909722222222222 | 0 |
| 0.8916666666666666 | 0 |
| 0.8923611111111112 | 0 |
| 0.8930555555555556 | 0 |
| 0.8937499999999999 | 0 |
| 0.8944444444444444 | 0 |
| 0.8951388888888889 | 0 |
| 0.8958333333333334 | 0 |
| 0.8965277777777777 | 0 |
| 0.8972222222222223 | 0 |
| 0.8979166666666667 | 0 |
| 0.8986111111111111 | 0 |
| 0.8993055555555555 | 0 |
| 0.9 | 0 |
| 0.9006944444444445 | 0 |
| 0.9013888888888889 | 0 |
| 0.9020833333333332 | 0 |
| 0.9027777777777778 | 0 |
| 0.9034722222222222 | 0 |
| 0.9041666666666667 | 0 |
| 0.904861111111111 | 0 |
| 0.9055555555555556 | 0 |
| 0.90625 | 0 |
| 0.9069444444444444 | 0 |
| 0.907638888888889 | 0 |
| 0.9083333333333333 | 0 |
| 0.9090277777777778 | 0 |
| 0.9097222222222222 | 0 |
| 0.9104166666666668 | 0 |
| 0.9111111111111111 | 0 |
| 0.9118055555555555 | 0 |
| 0.9125 | 0 |
| 0.9131944444444445 | 0 |
| 0.9138888888888889 | 0 |
| 0.9145833333333333 | 0 |
| 0.9152777777777777 | 0 |
| 0.9159722222222223 | 0 |
| 0.9166666666666666 | 0 |
| 0.9173611111111111 | 0 |
| 0.9180555555555556 | 0 |
| 0.9187500000000001 | 0 |
| 0.9194444444444444 | 0 |
| 0.9201388888888888 | 0 |
| 0.9208333333333334 | 0 |
| 0.9215277777777778 | 0 |
| 0.9222222222222222 | 0 |
| 0.9229166666666666 | 0 |
| 0.9236111111111112 | 0 |
| 0.9243055555555556 | 0 |
| 0.9249999999999999 | 0 |
| 0.9256944444444444 | 0 |
| 0.9263888888888889 | 0 |
| 0.9270833333333334 | 0 |
| 0.9277777777777777 | 0 |
| 0.9284722222222223 | 0 |
| 0.9291666666666667 | 0 |
| 0.9298611111111111 | 0 |
| 0.9305555555555555 | 0 |
| 0.93125 | 0 |
| 0.9319444444444445 | 0 |
| 0.9326388888888889 | 0 |
| 0.9333333333333332 | 0 |
| 0.9340277777777778 | 0 |
| 0.9347222222222222 | 0 |
| 0.9354166666666667 | 0 |
| 0.936111111111111 | 0 |
| 0.9368055555555556 | 0 |
| 0.9375 | 0 |
| 0.9381944444444444 | 0 |
| 0.938888888888889 | 0 |
| 0.9395833333333333 | 0 |
| 0.9402777777777778 | 0 |
| 0.9409722222222222 | 0 |
| 0.9416666666666668 | 0 |
| 0.9423611111111111 | 0 |
| 0.9430555555555555 | 0 |
| 0.94375 | 0 |
| 0.9444444444444445 | 0 |
| 0.9451388888888889 | 0 |
| 0.9458333333333333 | 0 |
| 0.9465277777777777 | 0 |
| 0.9472222222222223 | 0 |
| 0.9479166666666666 | 0 |
| 0.9486111111111111 | 0 |
| 0.9493055555555556 | 0 |
| 0.9500000000000001 | 0 |
| 0.9506944444444444 | 0 |
| 0.9513888888888888 | 0 |
| 0.9520833333333334 | 0 |
| 0.9527777777777778 | 0 |
| 0.9534722222222222 | 0 |
| 0.9541666666666666 | 0 |
| 0.9548611111111112 | 0 |
| 0.9555555555555556 | 0 |
| 0.9562499999999999 | 0 |
| 0.9569444444444444 | 0 |
| 0.9576388888888889 | 0 |
| 0.9583333333333334 | 0 |
| 0.9590277777777777 | 0 |
| 0.9597222222222223 | 0 |
| 0.9604166666666667 | 0 |
| 0.9611111111111111 | 0 |
| 0.9618055555555555 | 0 |
| 0.9625 | 0 |
| 0.9631944444444445 | 0 |
| 0.9638888888888889 | 0 |
| 0.9645833333333332 | 0 |
| 0.9652777777777778 | 0 |
| 0.9659722222222222 | 0 |
| 0.9666666666666667 | 0 |
| 0.967361111111111 | 0 |
| 0.9680555555555556 | 0 |
| 0.96875 | 0 |
| 0.9694444444444444 | 0 |
| 0.970138888888889 | 0 |
| 0.9708333333333333 | 0 |
| 0.9715277777777778 | 0 |
| 0.9722222222222222 | 0 |
| 0.9729166666666668 | 0 |
| 0.9736111111111111 | 0 |
| 0.9743055555555555 | 0 |
| 0.975 | 0 |
| 0.9756944444444445 | 0 |
| 0.9763888888888889 | 0 |
| 0.9770833333333333 | 0 |
| 0.9777777777777777 | 0 |
| 0.9784722222222223 | 0 |
| 0.9791666666666666 | 0 |
| 0.9798611111111111 | 0 |
| 0.9805555555555556 | 0 |
| 0.9812500000000001 | 0 |
| 0.9819444444444444 | 0 |
| 0.9826388888888888 | 0 |
| 0.9833333333333334 | 0 |
| 0.9840277777777778 | 0 |
| 0.9847222222222222 | 0 |
| 0.9854166666666666 | 0 |
| 0.9861111111111112 | 0 |
| 0.9868055555555556 | 0 |
| 0.9874999999999999 | 0 |
| 0.9881944444444444 | 0 |
| 0.9888888888888889 | 0 |
| 0.9895833333333334 | 0 |
| 0.9902777777777777 | 0 |
| 0.9909722222222223 | 0 |
| 0.9916666666666667 | 0 |
| 0.9923611111111111 | 0 |
| 0.9930555555555555 | 0 |
| 0.99375 | 0 |
| 0.9944444444444445 | 0 |
| 0.9951388888888889 | 0 |
| 0.9958333333333332 | 0 |
| 0.9965277777777778 | 0 |
| 0.9972222222222222 | 0 |
| 0.9979166666666667 | 0 |
| 0.998611111111111 | 0 |
| 0.9993055555555556 | 0 |